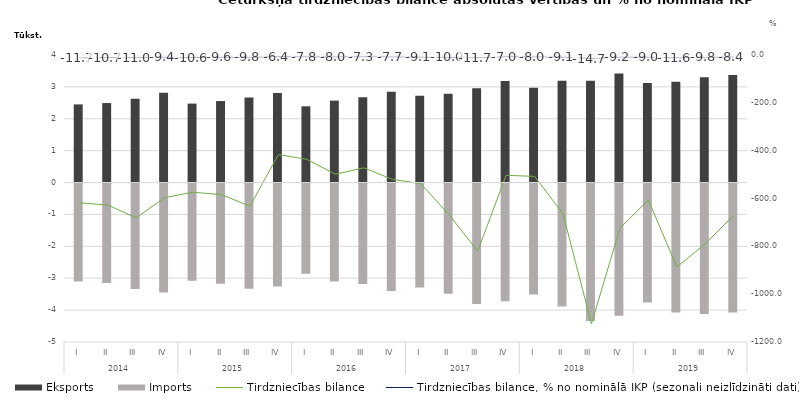
| Category | Eksports | Imports |
|---|---|---|
| 0 | 2450.7 | -3068.8 |
| 1 | 2493.4 | -3120.5 |
| 2 | 2625.5 | -3306.5 |
| 3 | 2816.7 | -3413.2 |
| 4 | 2476.5 | -3050.1 |
| 5 | 2555.2 | -3139.2 |
| 6 | 2663.4 | -3295.5 |
| 7 | 2809.5 | -3225.4 |
| 8 | 2391.5 | -2828.1 |
| 9 | 2569.5 | -3068 |
| 10 | 2678.2 | -3149.9 |
| 11 | 2850.8 | -3370.5 |
| 12 | 2719.6 | -3257.4 |
| 13 | 2783.8 | -3452 |
| 14 | 2956.9 | -3777.4 |
| 15 | 3187 | -3690 |
| 16 | 2969.9 | -3477.4 |
| 17 | 3193.3 | -3857.4 |
| 18 | 3189.7 | -4313.9 |
| 19 | 3420.5 | -4144.2 |
| 20 | 3123.6 | -3730.2 |
| 21 | 3158.2 | -4044.8 |
| 22 | 3298.5 | -4087.5 |
| 23 | 3370.8 | -4040.6 |